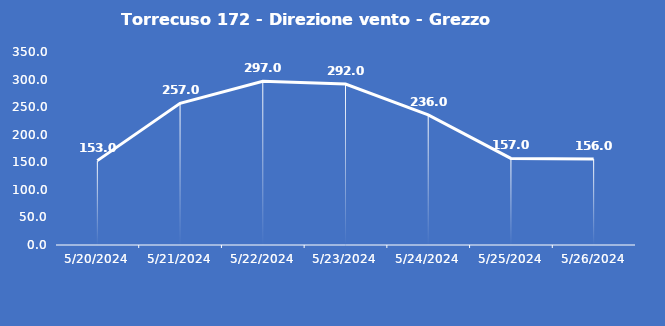
| Category | Torrecuso 172 - Direzione vento - Grezzo (°N) |
|---|---|
| 5/20/24 | 153 |
| 5/21/24 | 257 |
| 5/22/24 | 297 |
| 5/23/24 | 292 |
| 5/24/24 | 236 |
| 5/25/24 | 157 |
| 5/26/24 | 156 |